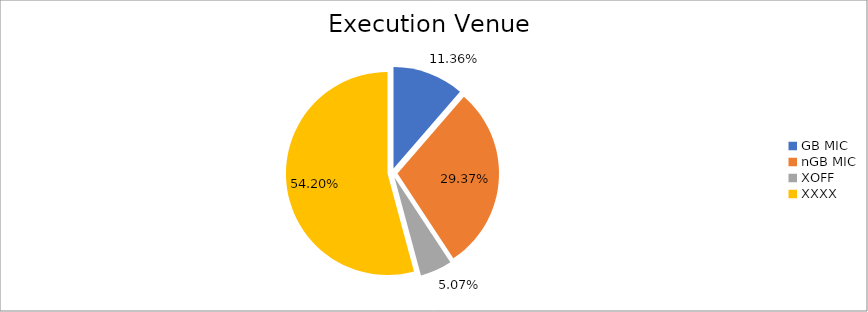
| Category | Series 0 |
|---|---|
| GB MIC | 1089913.729 |
| nGB MIC | 2819340.318 |
| XOFF | 486282.705 |
| XXXX | 5202457.356 |